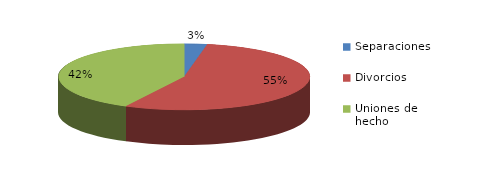
| Category | Series 0 |
|---|---|
| Separaciones | 46 |
| Divorcios | 859 |
| Uniones de hecho | 666 |